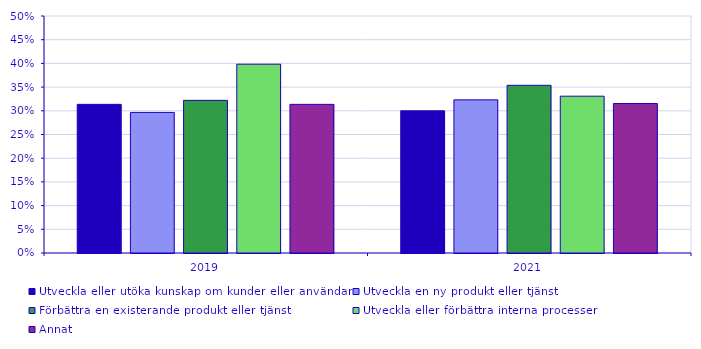
| Category | Utveckla eller utöka kunskap om kunder eller användare | Utveckla en ny produkt eller tjänst | Förbättra en existerande produkt eller tjänst | Utveckla eller förbättra interna processer | Annat |
|---|---|---|---|---|---|
| 2019.0 | 0.314 | 0.297 | 0.322 | 0.398 | 0.314 |
| 2021.0 | 0.3 | 0.323 | 0.354 | 0.331 | 0.315 |